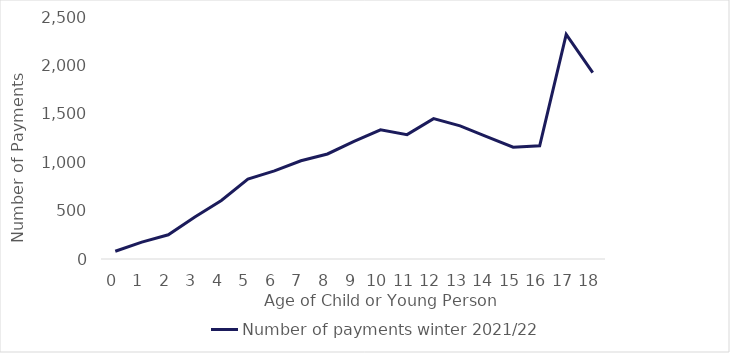
| Category | Number of payments winter 2021/22 |
|---|---|
| 0.0 | 80 |
| 1.0 | 175 |
| 2.0 | 250 |
| 3.0 | 435 |
| 4.0 | 605 |
| 5.0 | 825 |
| 6.0 | 910 |
| 7.0 | 1015 |
| 8.0 | 1085 |
| 9.0 | 1215 |
| 10.0 | 1335 |
| 11.0 | 1285 |
| 12.0 | 1450 |
| 13.0 | 1375 |
| 14.0 | 1265 |
| 15.0 | 1155 |
| 16.0 | 1170 |
| 17.0 | 2320 |
| 18.0 | 1925 |